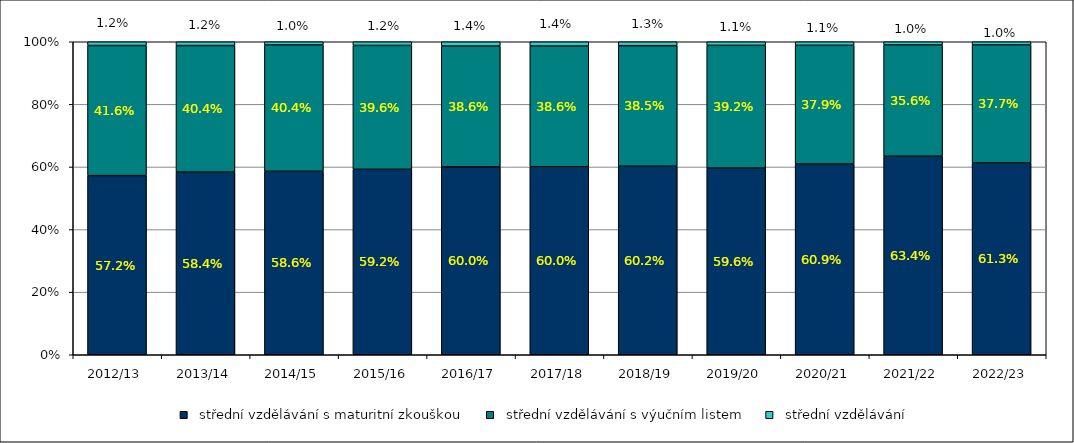
| Category |   střední vzdělávání s maturitní zkouškou |   střední vzdělávání s výučním listem |   střední vzdělávání  |
|---|---|---|---|
| 2012/13 | 0.572 | 0.416 | 0.012 |
| 2013/14 | 0.584 | 0.404 | 0.012 |
| 2014/15 | 0.586 | 0.404 | 0.01 |
| 2015/16 | 0.592 | 0.396 | 0.012 |
| 2016/17 | 0.6 | 0.386 | 0.014 |
| 2017/18 | 0.6 | 0.386 | 0.014 |
| 2018/19 | 0.602 | 0.385 | 0.013 |
| 2019/20 | 0.596 | 0.392 | 0.011 |
| 2020/21 | 0.609 | 0.379 | 0.011 |
| 2021/22 | 0.634 | 0.356 | 0.01 |
| 2022/23 | 0.613 | 0.377 | 0.01 |